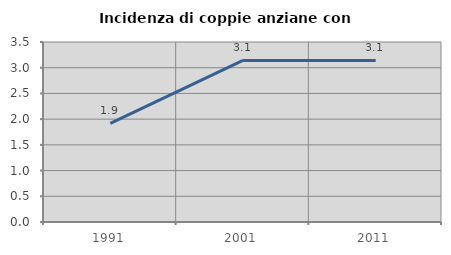
| Category | Incidenza di coppie anziane con figli |
|---|---|
| 1991.0 | 1.919 |
| 2001.0 | 3.142 |
| 2011.0 | 3.142 |